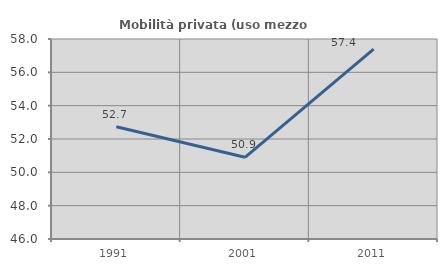
| Category | Mobilità privata (uso mezzo privato) |
|---|---|
| 1991.0 | 52.73 |
| 2001.0 | 50.903 |
| 2011.0 | 57.388 |